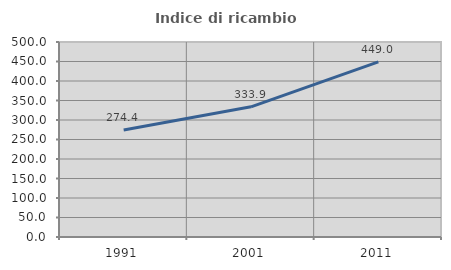
| Category | Indice di ricambio occupazionale  |
|---|---|
| 1991.0 | 274.419 |
| 2001.0 | 333.871 |
| 2011.0 | 449.02 |